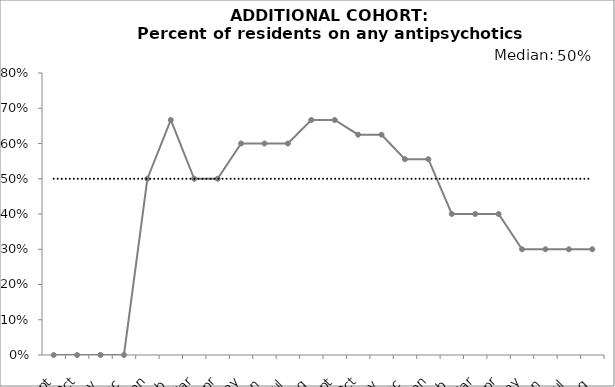
| Category | Total Use | Median |
|---|---|---|
| 2015-09-01 | 0 | 0.5 |
| 2015-10-01 | 0 | 0.5 |
| 2015-11-01 | 0 | 0.5 |
| 2015-12-01 | 0 | 0.5 |
| 2016-01-01 | 0.5 | 0.5 |
| 2016-02-01 | 0.667 | 0.5 |
| 2016-03-01 | 0.5 | 0.5 |
| 2016-04-01 | 0.5 | 0.5 |
| 2016-05-01 | 0.6 | 0.5 |
| 2016-06-01 | 0.6 | 0.5 |
| 2016-07-01 | 0.6 | 0.5 |
| 2016-08-01 | 0.667 | 0.5 |
| 2016-09-01 | 0.667 | 0.5 |
| 2016-10-01 | 0.625 | 0.5 |
| 2016-11-01 | 0.625 | 0.5 |
| 2016-12-01 | 0.556 | 0.5 |
| 2017-01-01 | 0.556 | 0.5 |
| 2017-02-01 | 0.4 | 0.5 |
| 2017-03-01 | 0.4 | 0.5 |
| 2017-04-01 | 0.4 | 0.5 |
| 2017-05-01 | 0.3 | 0.5 |
| 2017-06-01 | 0.3 | 0.5 |
| 2017-07-01 | 0.3 | 0.5 |
| 2017-08-01 | 0.3 | 0.5 |